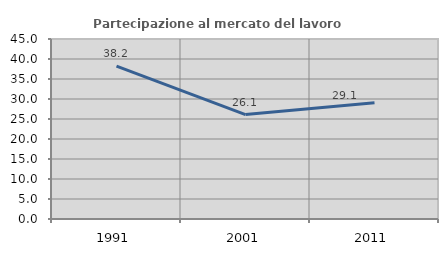
| Category | Partecipazione al mercato del lavoro  femminile |
|---|---|
| 1991.0 | 38.202 |
| 2001.0 | 26.114 |
| 2011.0 | 29.063 |